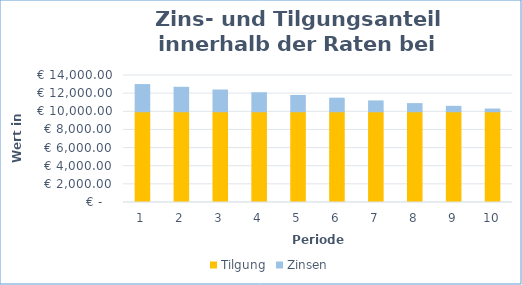
| Category | Tilgung | Zinsen |
|---|---|---|
| 0 | 10000 | 3000 |
| 1 | 10000 | 2700 |
| 2 | 10000 | 2400 |
| 3 | 10000 | 2100 |
| 4 | 10000 | 1800 |
| 5 | 10000 | 1500 |
| 6 | 10000 | 1200 |
| 7 | 10000 | 900 |
| 8 | 10000 | 600 |
| 9 | 10000 | 300 |